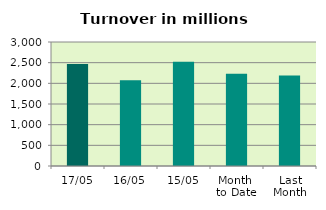
| Category | Series 0 |
|---|---|
| 17/05 | 2465.049 |
| 16/05 | 2071.596 |
| 15/05 | 2523.947 |
| Month 
to Date | 2233.897 |
| Last
Month | 2186.926 |